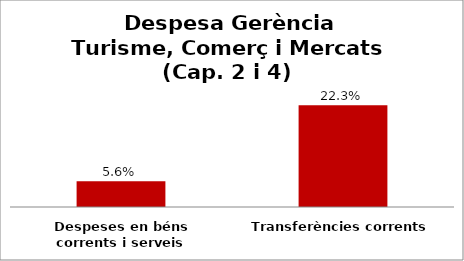
| Category | Series 0 |
|---|---|
| Despeses en béns corrents i serveis | 0.056 |
| Transferències corrents | 0.223 |